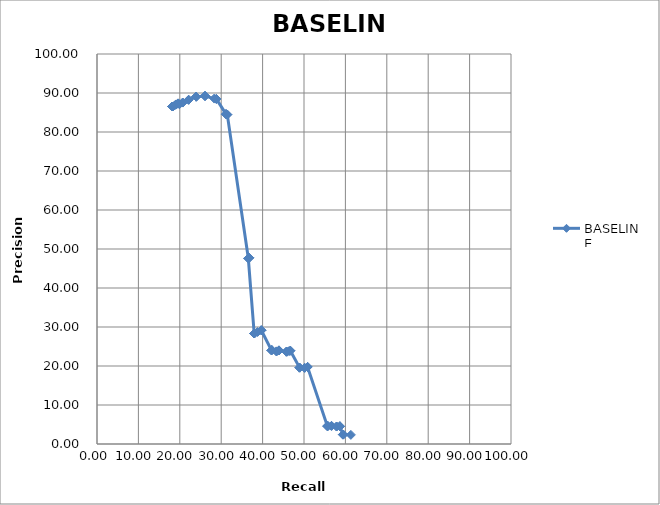
| Category | BASELINE |
|---|---|
| 18.274 | 86.538 |
| 18.274 | 86.538 |
| 18.274 | 86.538 |
| 18.274 | 86.538 |
| 18.274 | 86.538 |
| 18.274 | 86.538 |
| 18.274 | 86.538 |
| 18.274 | 86.538 |
| 18.274 | 86.538 |
| 18.274 | 86.538 |
| 18.274 | 86.538 |
| 18.274 | 86.538 |
| 18.274 | 86.538 |
| 18.274 | 86.538 |
| 18.274 | 86.538 |
| 18.274 | 86.538 |
| 18.274 | 86.538 |
| 18.274 | 86.538 |
| 18.782 | 86.854 |
| 19.086 | 87.037 |
| 19.188 | 87.097 |
| 19.594 | 87.33 |
| 19.594 | 87.33 |
| 19.898 | 87.111 |
| 20.711 | 87.554 |
| 20.711 | 87.554 |
| 22.132 | 88.259 |
| 22.132 | 88.259 |
| 23.959 | 89.057 |
| 23.959 | 89.057 |
| 23.959 | 89.057 |
| 26.091 | 89.236 |
| 26.091 | 89.236 |
| 26.091 | 89.236 |
| 28.325 | 88.571 |
| 28.832 | 88.474 |
| 28.832 | 88.474 |
| 31.168 | 84.573 |
| 31.168 | 84.573 |
| 31.168 | 84.573 |
| 31.472 | 84.469 |
| 31.472 | 84.469 |
| 36.548 | 47.619 |
| 36.548 | 47.619 |
| 36.548 | 47.619 |
| 36.751 | 47.757 |
| 36.751 | 47.757 |
| 36.751 | 47.757 |
| 37.97 | 28.333 |
| 37.97 | 28.333 |
| 37.97 | 28.333 |
| 37.97 | 28.333 |
| 38.782 | 28.722 |
| 39.695 | 29.157 |
| 39.695 | 29.157 |
| 39.695 | 29.157 |
| 42.132 | 24.03 |
| 42.132 | 24.03 |
| 42.132 | 24.03 |
| 42.234 | 24.074 |
| 42.234 | 24.074 |
| 43.35 | 23.735 |
| 43.35 | 23.735 |
| 43.959 | 23.989 |
| 43.959 | 23.989 |
| 43.959 | 23.989 |
| 43.959 | 23.989 |
| 45.787 | 23.675 |
| 45.787 | 23.675 |
| 45.787 | 23.675 |
| 45.787 | 23.675 |
| 46.396 | 23.814 |
| 46.701 | 23.933 |
| 46.701 | 23.933 |
| 48.934 | 19.578 |
| 48.934 | 19.578 |
| 48.934 | 19.578 |
| 50.152 | 19.526 |
| 50.152 | 19.526 |
| 50.863 | 19.748 |
| 50.863 | 19.748 |
| 50.863 | 19.748 |
| 50.863 | 19.748 |
| 50.863 | 19.748 |
| 55.635 | 4.597 |
| 55.635 | 4.597 |
| 55.635 | 4.597 |
| 55.635 | 4.597 |
| 55.838 | 4.601 |
| 56.65 | 4.649 |
| 56.65 | 4.649 |
| 57.868 | 4.483 |
| 57.868 | 4.483 |
| 58.68 | 4.539 |
| 58.68 | 4.539 |
| 58.68 | 4.539 |
| 59.391 | 2.415 |
| 59.391 | 2.415 |
| 59.492 | 2.419 |
| 59.492 | 2.419 |
| 61.32 | 2.341 |